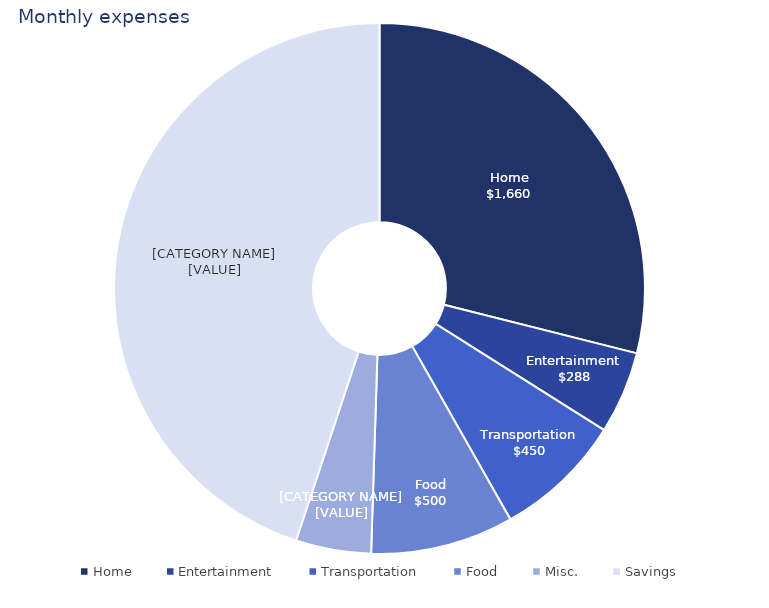
| Category | Series 0 |
|---|---|
| Home | 1660 |
| Entertainment | 288 |
| Transportation | 450 |
| Food | 500 |
| Misc. | 263 |
| Savings | 2577 |